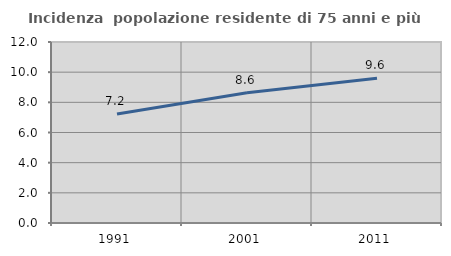
| Category | Incidenza  popolazione residente di 75 anni e più |
|---|---|
| 1991.0 | 7.226 |
| 2001.0 | 8.64 |
| 2011.0 | 9.596 |